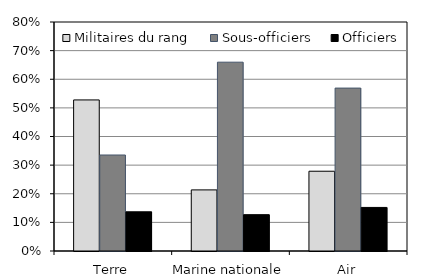
| Category | Militaires du rang | Sous-officiers | Officiers |
|---|---|---|---|
| Terre | 0.528 | 0.335 | 0.137 |
| Marine nationale | 0.213 | 0.66 | 0.127 |
| Air | 0.279 | 0.569 | 0.152 |